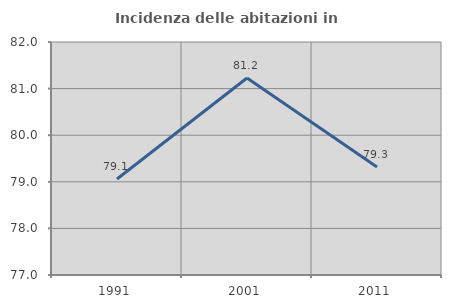
| Category | Incidenza delle abitazioni in proprietà  |
|---|---|
| 1991.0 | 79.06 |
| 2001.0 | 81.227 |
| 2011.0 | 79.32 |